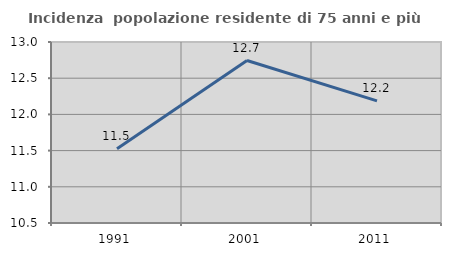
| Category | Incidenza  popolazione residente di 75 anni e più |
|---|---|
| 1991.0 | 11.526 |
| 2001.0 | 12.744 |
| 2011.0 | 12.187 |